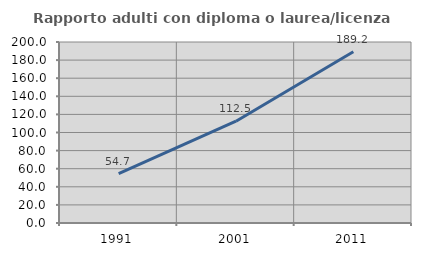
| Category | Rapporto adulti con diploma o laurea/licenza media  |
|---|---|
| 1991.0 | 54.651 |
| 2001.0 | 112.5 |
| 2011.0 | 189.189 |